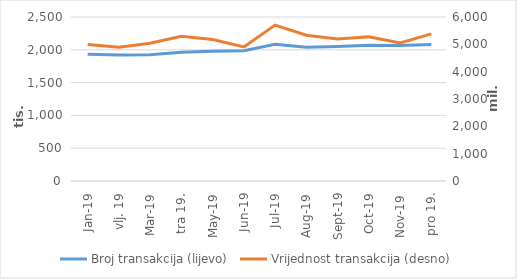
| Category | Broj transakcija (lijevo) |
|---|---|
| sij.19 | 1932393 |
| vlj. 19 | 1921638 |
| ožu.19 | 1923804 |
| tra 19. | 1962470 |
| svi.19 | 1977784 |
| lip.19 | 1986816 |
| srp.19 | 2085605 |
| kol.19 | 2040569 |
| ruj.19 | 2050439 |
| lis.19 | 2068897 |
| stu.19 | 2066452 |
| pro 19. | 2079103 |